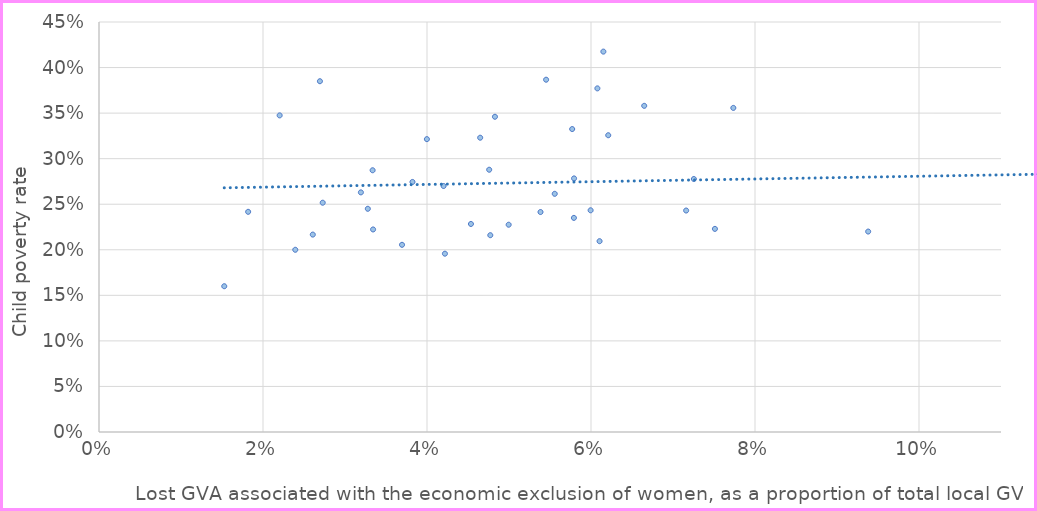
| Category | Series 0 |
|---|---|
| 0.17116865203761752 | 0.234 |
| 0.09380198790322582 | 0.22 |
| 0.07735722566037737 | 0.356 |
| 0.0751122062062062 | 0.223 |
| 0.07254322294654499 | 0.278 |
| 0.07160296101159115 | 0.243 |
| 0.06648967784642543 | 0.358 |
| 0.062102280130293175 | 0.326 |
| 0.06150891553133514 | 0.418 |
| 0.061044932754880696 | 0.209 |
| 0.06077884889643464 | 0.377 |
| 0.05995380300500836 | 0.243 |
| 0.05793449269005846 | 0.278 |
| 0.05791646004842615 | 0.235 |
| 0.05770551581508515 | 0.332 |
| 0.05557762123197904 | 0.261 |
| 0.054525141612200456 | 0.387 |
| 0.0538419826275787 | 0.241 |
| 0.0499583532526475 | 0.228 |
| 0.04828589192708334 | 0.346 |
| 0.047718958904109605 | 0.216 |
| 0.047583865871833074 | 0.288 |
| 0.046485588681849564 | 0.323 |
| 0.045358235203689465 | 0.228 |
| 0.04218499870633894 | 0.196 |
| 0.04202452783505156 | 0.27 |
| 0.0399869740034662 | 0.321 |
| 0.03822834847233691 | 0.274 |
| 0.036953258799171836 | 0.205 |
| 0.03342472818311874 | 0.222 |
| 0.03336797150610582 | 0.287 |
| 0.03278204016064257 | 0.245 |
| 0.03193703531598513 | 0.263 |
| 0.0272816023222061 | 0.252 |
| 0.026940947122861603 | 0.385 |
| 0.026070930232558152 | 0.217 |
| 0.023937378048780492 | 0.2 |
| 0.022031014975041573 | 0.348 |
| 0.01818912255772647 | 0.242 |
| 0.015274490842490836 | 0.16 |